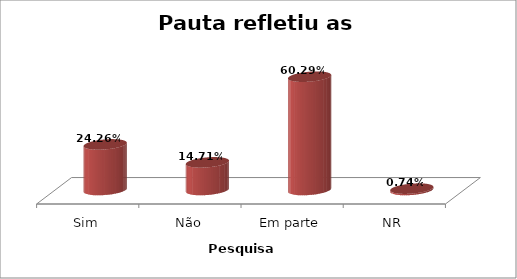
| Category | Series 0 |
|---|---|
| Sim | 0.243 |
| Não | 0.147 |
| Em parte | 0.603 |
| NR | 0.007 |